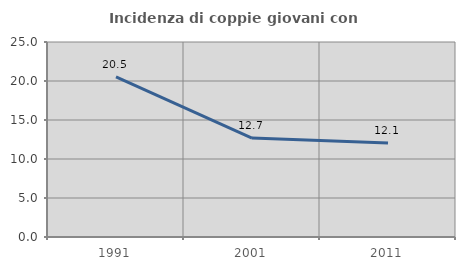
| Category | Incidenza di coppie giovani con figli |
|---|---|
| 1991.0 | 20.526 |
| 2001.0 | 12.69 |
| 2011.0 | 12.06 |